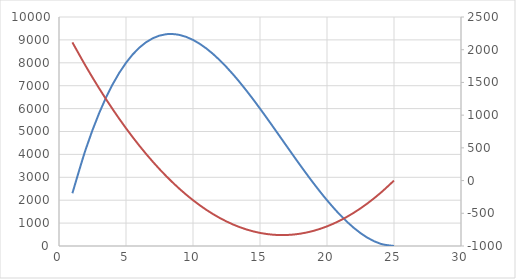
| Category | V |
|---|---|
| 1.0 | 2304 |
| 2.0 | 4232 |
| 3.0 | 5808 |
| 4.0 | 7056 |
| 5.0 | 8000 |
| 6.0 | 8664 |
| 7.0 | 9072 |
| 8.0 | 9248 |
| 9.0 | 9216 |
| 10.0 | 9000 |
| 11.0 | 8624 |
| 12.0 | 8112 |
| 13.0 | 7488 |
| 14.0 | 6776 |
| 15.0 | 6000 |
| 16.0 | 5184 |
| 17.0 | 4352 |
| 18.0 | 3528 |
| 19.0 | 2736 |
| 20.0 | 2000 |
| 21.0 | 1344 |
| 22.0 | 792 |
| 23.0 | 368 |
| 24.0 | 96 |
| 25.0 | 0 |